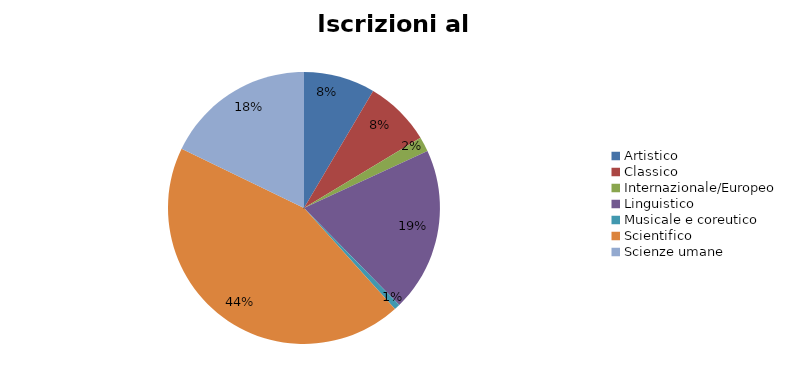
| Category | Series 0 | Series 1 |
|---|---|---|
| Artistico | 1556 |  |
| Classico | 1445 |  |
| Internazionale/Europeo | 319 |  |
| Linguistico | 3579 |  |
| Musicale e coreutico | 128 |  |
| Scientifico | 8033 |  |
| Scienze umane | 3267 |  |